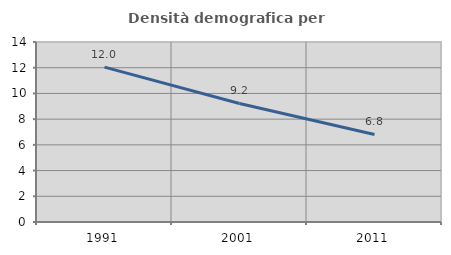
| Category | Densità demografica |
|---|---|
| 1991.0 | 12.049 |
| 2001.0 | 9.221 |
| 2011.0 | 6.812 |